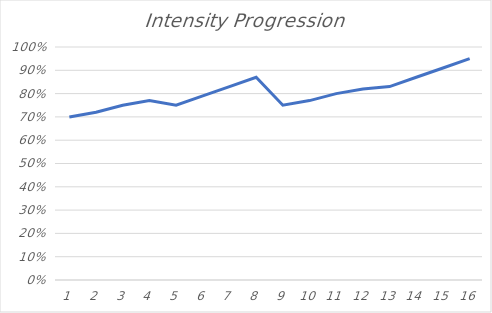
| Category | Series 0 |
|---|---|
| 0 | 0.7 |
| 1 | 0.72 |
| 2 | 0.75 |
| 3 | 0.77 |
| 4 | 0.75 |
| 5 | 0.79 |
| 6 | 0.83 |
| 7 | 0.87 |
| 8 | 0.75 |
| 9 | 0.77 |
| 10 | 0.8 |
| 11 | 0.82 |
| 12 | 0.83 |
| 13 | 0.87 |
| 14 | 0.91 |
| 15 | 0.95 |